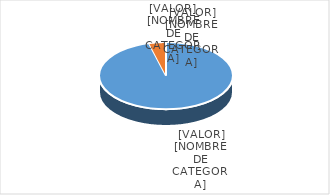
| Category | Series 0 |
|---|---|
| PRESUPUESTO VIGENTE PARA 2023 | 497004000 |
| PRESUPUESTO EJECUTADO  | 21270489.85 |
| PORCENTAJE DE EJECUCIÓN  | 0.043 |